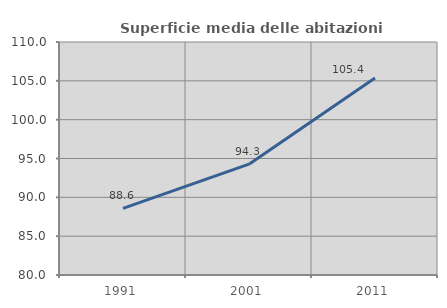
| Category | Superficie media delle abitazioni occupate |
|---|---|
| 1991.0 | 88.585 |
| 2001.0 | 94.273 |
| 2011.0 | 105.378 |